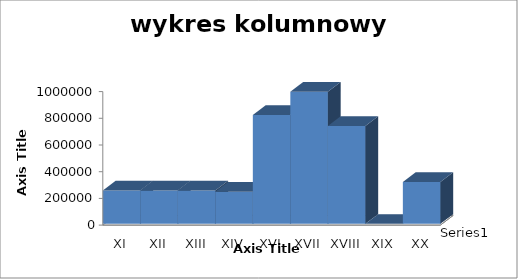
| Category | Series 0 |
|---|---|
| XI | 250000 |
| XII | 250000 |
| XIII | 250000 |
| XIV | 240000 |
| XVI | 815000 |
| XVII | 990000 |
| XVIII | 733000 |
| XIX | 0 |
| XX | 313000 |